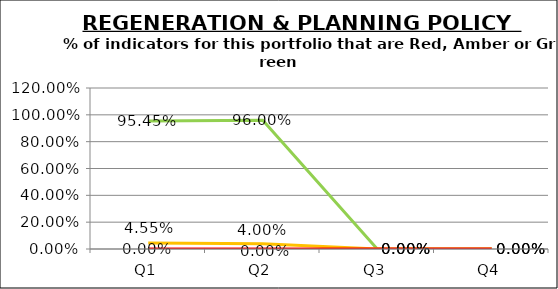
| Category | Green | Amber | Red |
|---|---|---|---|
| Q1 | 0.955 | 0.045 | 0 |
| Q2 | 0.96 | 0.04 | 0 |
| Q3 | 0 | 0 | 0 |
| Q4 | 0 | 0 | 0 |